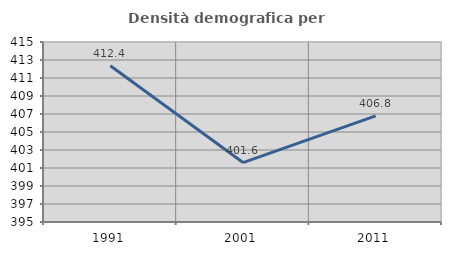
| Category | Densità demografica |
|---|---|
| 1991.0 | 412.358 |
| 2001.0 | 401.603 |
| 2011.0 | 406.793 |